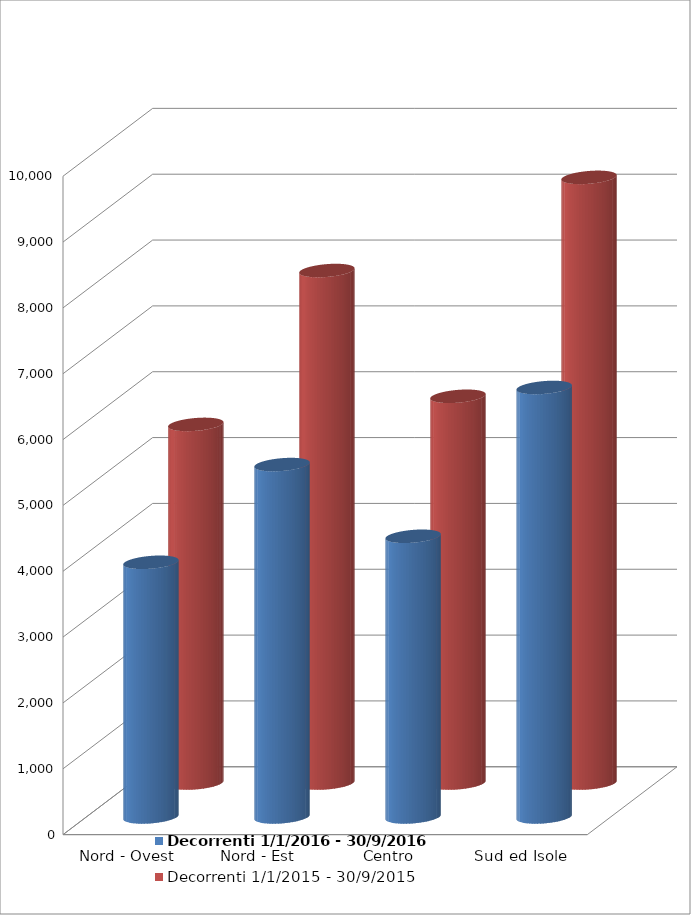
| Category | Decorrenti 1/1/2016 - 30/9/2016 | Decorrenti 1/1/2015 - 30/9/2015 |
|---|---|---|
| Nord - Ovest | 3868 | 5447 |
| Nord - Est | 5352 | 7784 |
| Centro | 4263 | 5874 |
| Sud ed Isole | 6523 | 9199 |